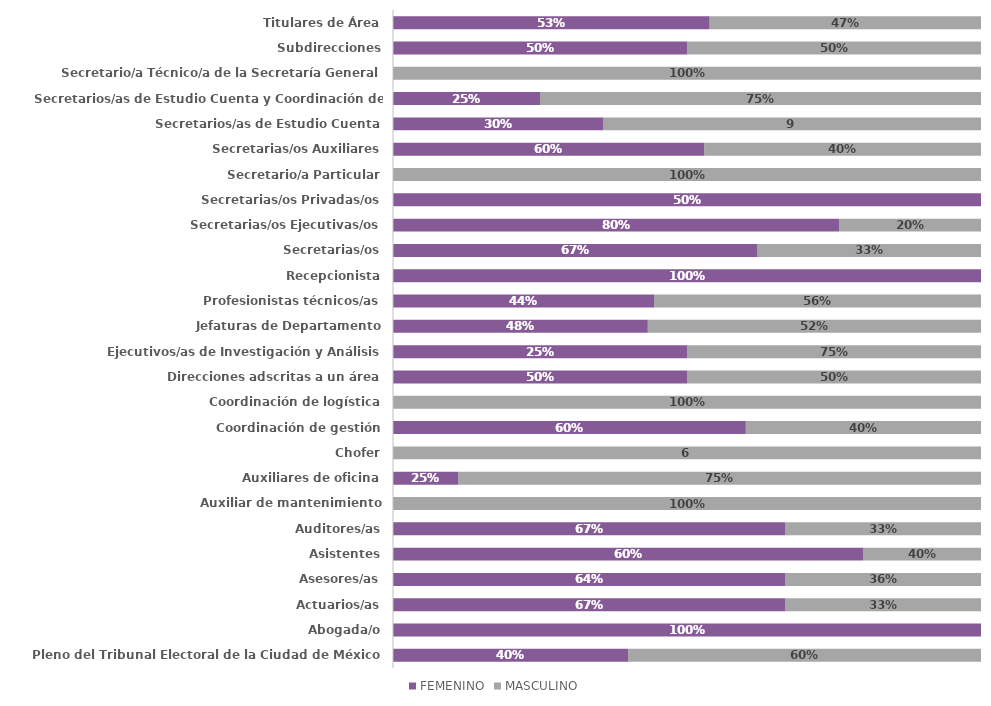
| Category | FEMENINO | MASCULINO |
|---|---|---|
| Pleno del Tribunal Electoral de la Ciudad de México | 2 | 3 |
| Abogada/o | 1 | 0 |
| Actuarios/as | 2 | 1 |
| Asesores/as | 8 | 4 |
| Asistentes | 4 | 1 |
| Auditores/as | 2 | 1 |
| Auxiliar de mantenimiento | 0 | 1 |
| Auxiliares de oficina | 1 | 8 |
| Chofer | 0 | 6 |
| Coordinación de gestión | 3 | 2 |
| Coordinación de logística | 0 | 1 |
| Direcciones adscritas a un área | 2 | 2 |
| Ejecutivos/as de Investigación y Análisis | 2 | 2 |
| Jefaturas de Departamento | 13 | 17 |
| Profesionistas técnicos/as | 8 | 10 |
| Recepcionista | 1 | 0 |
| Secretarias/os | 13 | 8 |
| Secretarias/os Ejecutivas/os | 22 | 7 |
| Secretarias/os Privadas/os | 1 | 0 |
| Secretario/a Particular | 0 | 1 |
| Secretarias/os Auxiliares | 9 | 8 |
| Secretarios/as de Estudio Cuenta | 5 | 9 |
| Secretarios/as de Estudio Cuenta y Coordinación de Ponencia | 1 | 3 |
| Secretario/a Técnico/a de la Secretaría General | 0 | 1 |
| Subdirecciones | 8 | 8 |
| Titulares de Área | 7 | 6 |